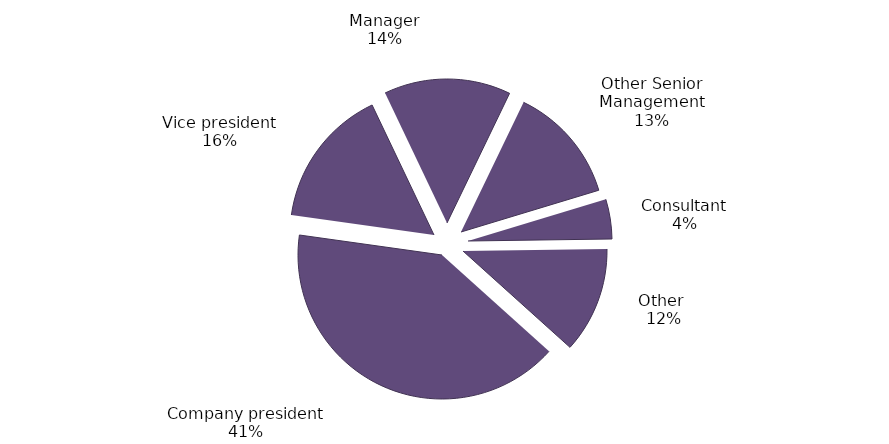
| Category | Series 0 |
|---|---|
| Company president | 0.406 |
| Vice president | 0.157 |
| Manager | 0.142 |
| Other Senior Management | 0.132 |
| Consultant | 0.045 |
| Other  | 0.119 |